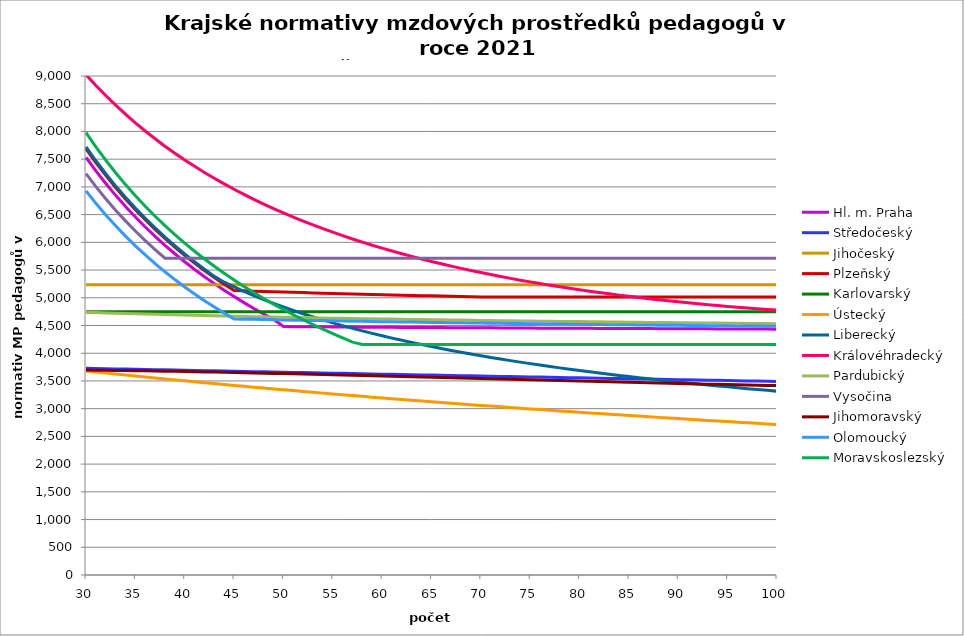
| Category | Hl. m. Praha | Středočeský | Jihočeský | Plzeňský | Karlovarský  | Ústecký   | Liberecký | Královéhradecký | Pardubický | Vysočina | Jihomoravský | Olomoucký | Moravskoslezský |
|---|---|---|---|---|---|---|---|---|---|---|---|---|---|
| 30.0 | 7532 | 3728.447 | 5236.605 | 7688.2 | 4750 | 3680.13 | 7720 | 9023.937 | 4738.381 | 7238.6 | 3695.908 | 6927 | 7980 |
| 31.0 | 7289.032 | 3724.83 | 5236.605 | 7440.194 | 4750 | 3661.273 | 7470.968 | 8829.534 | 4732.551 | 7005.097 | 3694.061 | 6703.548 | 7722.581 |
| 32.0 | 7061.25 | 3721.221 | 5236.605 | 7207.688 | 4750 | 3642.934 | 7237.5 | 8648.007 | 4726.919 | 6786.188 | 3691.908 | 6494.062 | 7481.25 |
| 33.0 | 6847.273 | 3717.619 | 5236.605 | 6989.273 | 4750 | 3624.778 | 7018.182 | 8475.292 | 4721.474 | 6580.545 | 3689.758 | 6297.273 | 7254.545 |
| 34.0 | 6645.882 | 3714.023 | 5236.605 | 6783.706 | 4750 | 3606.801 | 6811.765 | 8310.78 | 4716.204 | 6387 | 3687.304 | 6112.059 | 7041.176 |
| 35.0 | 6456 | 3710.435 | 5236.605 | 6589.886 | 4750 | 3589.002 | 6617.143 | 8155.306 | 4711.097 | 6204.514 | 3684.853 | 5937.429 | 6840 |
| 36.0 | 6276.667 | 3706.853 | 5236.605 | 6406.833 | 4750 | 3571.378 | 6433.333 | 8008.216 | 4706.145 | 6032.167 | 3682.099 | 5772.5 | 6650 |
| 37.0 | 6107.027 | 3703.279 | 5236.605 | 6233.676 | 4750 | 3553.617 | 6259.459 | 7867.629 | 4701.339 | 5869.135 | 3679.35 | 5616.486 | 6470.27 |
| 38.0 | 5946.316 | 3699.711 | 5236.605 | 6069.632 | 4750 | 3536.338 | 6094.737 | 7734.387 | 4696.67 | 5714.684 | 3676.299 | 5468.684 | 6300 |
| 39.0 | 5793.846 | 3696.15 | 5236.605 | 5914 | 4750 | 3519.226 | 5938.462 | 7607.996 | 4692.131 | 5714.684 | 3673.254 | 5328.462 | 6138.462 |
| 40.0 | 5649 | 3692.596 | 5236.605 | 5766.15 | 4750 | 3502.279 | 5790 | 7486.838 | 4687.716 | 5714.684 | 3669.911 | 5195.25 | 5985 |
| 41.0 | 5511.22 | 3689.049 | 5236.605 | 5625.512 | 4750 | 3485.494 | 5648.78 | 7370.612 | 4683.418 | 5714.684 | 3666.573 | 5068.537 | 5839.024 |
| 42.0 | 5380 | 3685.509 | 5236.605 | 5491.571 | 4750 | 3468.574 | 5514.286 | 7260.136 | 4679.231 | 5714.684 | 3663.241 | 4947.857 | 5700 |
| 43.0 | 5254.884 | 3681.975 | 5236.605 | 5363.86 | 4750 | 3452.111 | 5386.047 | 7155.058 | 4675.149 | 5714.684 | 3659.614 | 4832.791 | 5567.442 |
| 44.0 | 5135.455 | 3678.448 | 5236.605 | 5241.955 | 4750 | 3435.802 | 5281.298 | 7054.016 | 4671.169 | 5714.684 | 3655.993 | 4722.955 | 5440.909 |
| 45.0 | 5021.333 | 3674.928 | 5236.605 | 5131.739 | 4750 | 3419.647 | 5196.908 | 6957.806 | 4667.284 | 5714.684 | 3652.38 | 4618 | 5320 |
| 46.0 | 4912.174 | 3671.415 | 5236.605 | 5126.036 | 4750 | 3403.644 | 5116.941 | 6865.168 | 4663.491 | 5714.684 | 3648.474 | 4614.411 | 5204.348 |
| 47.0 | 4807.66 | 3667.908 | 5236.605 | 5119.778 | 4750 | 3387.789 | 5041.041 | 6775.922 | 4659.786 | 5714.684 | 3644.576 | 4610.828 | 5093.617 |
| 48.0 | 4707.5 | 3664.408 | 5236.605 | 5114.102 | 4750 | 3371.802 | 4968.889 | 6690.833 | 4656.164 | 5714.684 | 3640.686 | 4607.25 | 4987.5 |
| 49.0 | 4611.429 | 3660.915 | 5236.605 | 5109.004 | 4750 | 3356.242 | 4900.199 | 6609.676 | 4652.622 | 5714.684 | 3636.507 | 4603.677 | 4885.714 |
| 50.0 | 4480.666 | 3657.429 | 5236.605 | 5103.352 | 4750 | 3340.825 | 4834.714 | 6531.354 | 4649.157 | 5714.684 | 3632.634 | 4600.111 | 4788 |
| 51.0 | 4479.334 | 3653.949 | 5236.605 | 5098.276 | 4750 | 3325.549 | 4772.202 | 6455.735 | 4645.766 | 5714.684 | 3628.473 | 4596.549 | 4694.118 |
| 52.0 | 4478.002 | 3650.475 | 5236.605 | 5093.21 | 4750 | 3310.412 | 4712.454 | 6383.546 | 4642.446 | 5714.684 | 3624.025 | 4593.501 | 4603.846 |
| 53.0 | 4476.672 | 3647.009 | 5236.605 | 5088.154 | 4750 | 3295.146 | 4655.281 | 6313.785 | 4639.193 | 5714.684 | 3619.884 | 4590.457 | 4516.981 |
| 54.0 | 4475.342 | 3643.548 | 5236.605 | 5083.107 | 4750 | 3280.284 | 4600.509 | 6247.16 | 4636.005 | 5714.684 | 3615.457 | 4586.911 | 4433.333 |
| 55.0 | 4474.455 | 3640.095 | 5236.605 | 5078.63 | 4750 | 3265.555 | 4547.981 | 6182.723 | 4632.881 | 5714.684 | 3611.041 | 4583.876 | 4352.727 |
| 56.0 | 4473.127 | 3636.648 | 5236.605 | 5073.603 | 4750 | 3250.958 | 4497.554 | 6121.164 | 4629.816 | 5714.684 | 3606.636 | 4580.844 | 4275 |
| 57.0 | 4471.799 | 3633.207 | 5236.605 | 5069.143 | 4750 | 3236.491 | 4449.097 | 6060.819 | 4626.81 | 5714.684 | 3602.242 | 4577.817 | 4200 |
| 58.0 | 4470.472 | 3629.773 | 5236.605 | 5064.69 | 4750 | 3222.152 | 4402.489 | 6003.906 | 4623.86 | 5714.684 | 3597.858 | 4575.297 | 4159.138 |
| 59.0 | 4469.588 | 3626.346 | 5236.605 | 5060.246 | 4750 | 3207.687 | 4357.619 | 5948.053 | 4620.964 | 5714.684 | 3593.194 | 4572.277 | 4159.138 |
| 60.0 | 4468.262 | 3622.925 | 5236.605 | 5055.809 | 4750 | 3193.602 | 4314.387 | 5894.677 | 4618.12 | 5714.684 | 3588.832 | 4569.261 | 4159.138 |
| 61.0 | 4467.378 | 3619.51 | 5236.605 | 5051.38 | 4750 | 3179.639 | 4272.698 | 5843.675 | 4615.327 | 5714.684 | 3584.191 | 4566.751 | 4159.138 |
| 62.0 | 4466.054 | 3616.102 | 5236.605 | 5046.958 | 4750 | 3165.799 | 4232.465 | 5794.248 | 4612.582 | 5714.684 | 3579.563 | 4563.742 | 4159.138 |
| 63.0 | 4465.171 | 3612.7 | 5236.605 | 5043.096 | 4750 | 3152.078 | 4193.609 | 5746.339 | 4609.885 | 5714.684 | 3574.946 | 4561.238 | 4159.138 |
| 64.0 | 4463.848 | 3609.305 | 5236.605 | 5038.689 | 4750 | 3138.234 | 4156.055 | 5699.893 | 4607.233 | 5714.684 | 3570.341 | 4558.736 | 4159.138 |
| 65.0 | 4462.967 | 3605.915 | 5236.605 | 5034.84 | 4750 | 3124.751 | 4119.735 | 5655.525 | 4604.625 | 5714.684 | 3565.747 | 4556.238 | 4159.138 |
| 66.0 | 4462.085 | 3602.533 | 5236.605 | 5030.996 | 4750 | 3111.383 | 4084.585 | 5612.5 | 4602.06 | 5714.684 | 3561.166 | 4553.243 | 4159.138 |
| 67.0 | 4460.764 | 3599.157 | 5236.605 | 5027.158 | 4750 | 3098.129 | 4050.544 | 5570.771 | 4599.536 | 5714.684 | 3556.596 | 4550.75 | 4159.138 |
| 68.0 | 4459.884 | 3595.787 | 5236.605 | 5023.326 | 4750 | 3084.987 | 4017.558 | 5530.934 | 4597.052 | 5714.684 | 3552.038 | 4548.758 | 4159.138 |
| 69.0 | 4459.003 | 3592.423 | 5236.605 | 5019.499 | 4750 | 3071.957 | 3985.575 | 5492.292 | 4594.608 | 5714.684 | 3547.492 | 4546.27 | 4159.138 |
| 70.0 | 4458.124 | 3589.065 | 5236.605 | 5015.679 | 4750 | 3058.806 | 3954.547 | 5454.806 | 4592.201 | 5714.684 | 3542.675 | 4543.785 | 4159.138 |
| 71.0 | 4457.244 | 3585.714 | 5236.605 | 5014.043 | 4750 | 3045.995 | 3924.428 | 5418.441 | 4589.83 | 5714.684 | 3538.152 | 4541.302 | 4159.138 |
| 72.0 | 4456.365 | 3582.369 | 5236.605 | 5014.043 | 4750 | 3033.291 | 3895.176 | 5383.766 | 4587.495 | 5714.684 | 3533.641 | 4538.823 | 4159.138 |
| 73.0 | 4455.047 | 3579.031 | 5236.605 | 5014.043 | 4750 | 3020.693 | 3866.752 | 5350.128 | 4585.195 | 5714.684 | 3528.861 | 4536.841 | 4159.138 |
| 74.0 | 4454.169 | 3575.698 | 5236.605 | 5014.043 | 4750 | 3008.199 | 3839.118 | 5317.498 | 4582.928 | 5714.684 | 3524.374 | 4534.366 | 4159.138 |
| 75.0 | 4453.291 | 3572.372 | 5236.605 | 5014.043 | 4750 | 2995.587 | 3812.239 | 5286.429 | 4580.694 | 5714.684 | 3519.898 | 4532.388 | 4159.138 |
| 76.0 | 4452.414 | 3569.052 | 5236.605 | 5014.043 | 4750 | 2983.299 | 3786.083 | 5255.721 | 4578.491 | 5714.684 | 3515.155 | 4529.918 | 4159.138 |
| 77.0 | 4451.537 | 3565.738 | 5236.605 | 5014.043 | 4750 | 2971.112 | 3760.618 | 5226.507 | 4576.32 | 5714.684 | 3510.703 | 4527.944 | 4159.138 |
| 78.0 | 4450.66 | 3562.43 | 5236.605 | 5014.043 | 4750 | 2959.024 | 3735.815 | 5198.179 | 4574.178 | 5714.684 | 3506.262 | 4525.972 | 4159.138 |
| 79.0 | 4449.783 | 3559.129 | 5236.605 | 5014.043 | 4750 | 2947.033 | 3711.647 | 5170.714 | 4572.066 | 5714.684 | 3501.832 | 4524.001 | 4159.138 |
| 80.0 | 4448.907 | 3555.833 | 5236.605 | 5014.043 | 4750 | 2935.14 | 3688.088 | 5144.641 | 4569.982 | 5714.684 | 3497.413 | 4521.54 | 4159.138 |
| 81.0 | 4448.469 | 3552.544 | 5236.605 | 5014.043 | 4750 | 2923.132 | 3665.114 | 5118.83 | 4567.926 | 5714.684 | 3493.006 | 4519.574 | 4159.138 |
| 82.0 | 4447.594 | 3549.261 | 5236.605 | 5014.043 | 4750 | 2911.43 | 3642.7 | 5094.359 | 4565.897 | 5714.684 | 3488.609 | 4517.609 | 4159.138 |
| 83.0 | 4446.718 | 3545.983 | 5236.605 | 5014.043 | 4750 | 2899.822 | 3620.826 | 5070.657 | 4563.894 | 5714.684 | 3484.224 | 4515.645 | 4159.138 |
| 84.0 | 4445.844 | 3542.712 | 5236.605 | 5014.043 | 4750 | 2888.306 | 3599.471 | 5047.705 | 4561.917 | 5714.684 | 3479.849 | 4513.684 | 4159.138 |
| 85.0 | 4444.969 | 3539.447 | 5236.605 | 5014.043 | 4750 | 2876.881 | 3578.614 | 5026.014 | 4559.965 | 5714.684 | 3475.486 | 4511.724 | 4159.138 |
| 86.0 | 4444.095 | 3536.188 | 5236.605 | 5014.043 | 4750 | 2865.546 | 3558.237 | 5004.508 | 4558.038 | 5714.684 | 3471.133 | 4509.766 | 4159.138 |
| 87.0 | 4443.658 | 3532.935 | 5236.605 | 5014.043 | 4750 | 2854.1 | 3538.322 | 4983.704 | 4556.134 | 5714.684 | 3467.063 | 4507.809 | 4159.138 |
| 88.0 | 4442.784 | 3529.688 | 5236.605 | 5014.043 | 4750 | 2842.943 | 3518.853 | 4964.099 | 4554.254 | 5714.684 | 3462.731 | 4506.343 | 4159.138 |
| 89.0 | 4441.911 | 3526.446 | 5236.605 | 5014.043 | 4750 | 2831.873 | 3499.814 | 4945.158 | 4552.396 | 5714.684 | 3458.68 | 4504.389 | 4159.138 |
| 90.0 | 4441.474 | 3523.211 | 5236.605 | 5014.043 | 4750 | 2820.889 | 3481.189 | 4926.361 | 4550.561 | 5714.684 | 3454.37 | 4502.437 | 4159.138 |
| 91.0 | 4440.601 | 3519.982 | 5236.605 | 5014.043 | 4750 | 2809.99 | 3462.963 | 4908.711 | 4548.748 | 5714.684 | 3450.338 | 4500.487 | 4159.138 |
| 92.0 | 4439.729 | 3516.758 | 5236.605 | 5014.043 | 4750 | 2798.983 | 3445.124 | 4891.686 | 4546.955 | 5714.684 | 3446.316 | 4499.026 | 4159.138 |
| 93.0 | 4439.293 | 3513.541 | 5236.605 | 5014.043 | 4750 | 2788.252 | 3427.657 | 4875.275 | 4545.184 | 5714.684 | 3442.304 | 4497.079 | 4159.138 |
| 94.0 | 4438.421 | 3510.329 | 5236.605 | 5014.043 | 4750 | 2777.603 | 3410.55 | 4859.465 | 4543.433 | 5714.684 | 3438.301 | 4495.619 | 4159.138 |
| 95.0 | 4437.549 | 3507.123 | 5236.605 | 5014.043 | 4750 | 2767.036 | 3393.792 | 4844.736 | 4541.701 | 5714.684 | 3434.307 | 4493.675 | 4159.138 |
| 96.0 | 4437.113 | 3503.923 | 5236.605 | 5014.043 | 4750 | 2756.548 | 3377.371 | 4830.097 | 4539.99 | 5714.684 | 3430.587 | 4492.218 | 4159.138 |
| 97.0 | 4436.242 | 3500.729 | 5236.605 | 5014.043 | 4750 | 2746.14 | 3361.275 | 4816.029 | 4538.297 | 5714.684 | 3426.611 | 4490.277 | 4159.138 |
| 98.0 | 4435.807 | 3497.541 | 5236.605 | 5014.043 | 4750 | 2735.626 | 3345.495 | 4802.524 | 4536.622 | 5714.684 | 3422.908 | 4488.822 | 4159.138 |
| 99.0 | 4434.936 | 3494.359 | 5236.605 | 5014.043 | 4750 | 2725.375 | 3330.02 | 4789.573 | 4534.966 | 5714.684 | 3418.95 | 4486.883 | 4159.138 |
| 100.0 | 4434.066 | 3491.182 | 5236.605 | 5014.043 | 4750 | 2715.2 | 3314.841 | 4777.643 | 4533.328 | 5714.684 | 3415.264 | 4485.431 | 4159.138 |